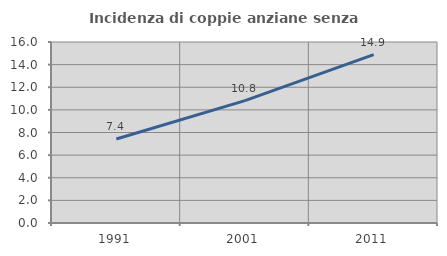
| Category | Incidenza di coppie anziane senza figli  |
|---|---|
| 1991.0 | 7.428 |
| 2001.0 | 10.822 |
| 2011.0 | 14.879 |